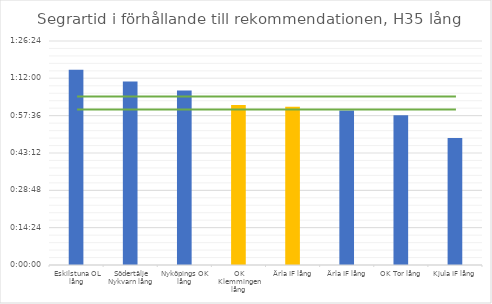
| Category | H35 tid |
|---|---|
| Eskilstuna OL lång | 0.052 |
| Södertälje Nykvarn lång | 0.049 |
| Nyköpings OK lång | 0.047 |
| OK Klemmingen lång | 0.043 |
| Ärla IF lång | 0.042 |
| Ärla IF lång | 0.041 |
| OK Tor lång | 0.04 |
| Kjula IF lång | 0.034 |